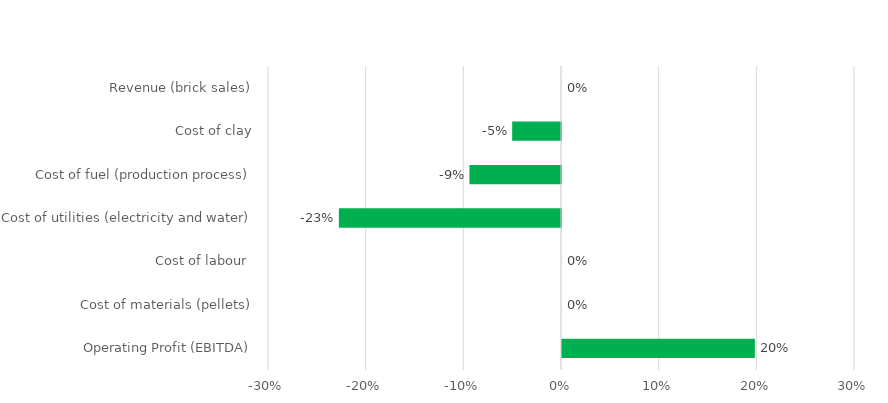
| Category | Performance |
|---|---|
| Operating Profit (EBITDA) | 0.197 |
| Cost of materials (pellets) | 0 |
| Cost of labour  | 0 |
| Cost of utilities (electricity and water) | -0.227 |
| Cost of fuel (production process) | -0.094 |
| Cost of clay | -0.05 |
| Revenue (brick sales) | 0 |